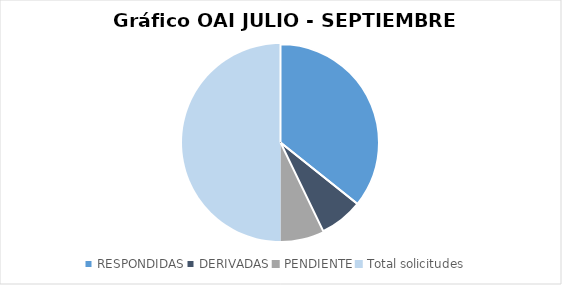
| Category | Series 0 |
|---|---|
| RESPONDIDAS | 5 |
| DERIVADAS | 1 |
| PENDIENTE | 1 |
| Total solicitudes | 7 |